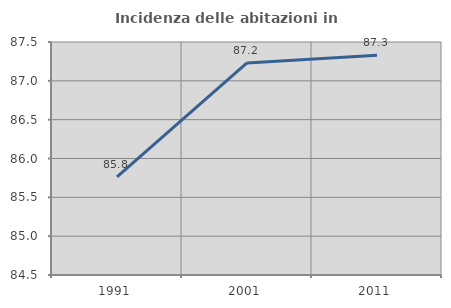
| Category | Incidenza delle abitazioni in proprietà  |
|---|---|
| 1991.0 | 85.764 |
| 2001.0 | 87.231 |
| 2011.0 | 87.33 |